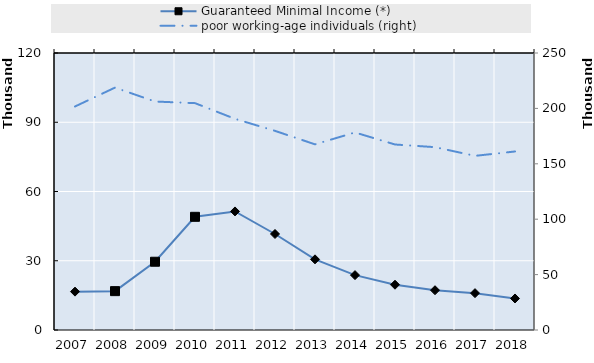
| Category | Guaranteed Minimal Income (*) | Series 4 | Series 5 | Series 6 | Series 7 | Series 8 | Series 9 | Series 10 | Series 11 | Series 12 | Series 13 | Series 14 | Series 15 | Series 16 | Series 17 | Series 18 | Series 19 |
|---|---|---|---|---|---|---|---|---|---|---|---|---|---|---|---|---|---|
| 2007.0 | 16619 |  |  |  |  |  |  |  |  |  |  |  |  |  |  |  |  |
| 2008.0 | 16835 |  |  |  |  |  |  |  |  |  |  |  |  |  |  |  |  |
| 2009.0 | 29573 |  |  |  |  |  |  |  |  |  |  |  |  |  |  |  |  |
| 2010.0 | 49034 |  |  |  |  |  |  |  |  |  |  |  |  |  |  |  |  |
| 2011.0 | 51369 |  |  |  |  |  |  |  |  |  |  |  |  |  |  |  |  |
| 2012.0 | 41595 |  |  |  |  |  |  |  |  |  |  |  |  |  |  |  |  |
| 2013.0 | 30613 |  |  |  |  |  |  |  |  |  |  |  |  |  |  |  |  |
| 2014.0 | 23776 |  |  |  |  |  |  |  |  |  |  |  |  |  |  |  |  |
| 2015.0 | 19610 |  |  |  |  |  |  |  |  |  |  |  |  |  |  |  |  |
| 2016.0 | 17229 |  |  |  |  |  |  |  |  |  |  |  |  |  |  |  |  |
| 2017.0 | 15962 |  |  |  |  |  |  |  |  |  |  |  |  |  |  |  |  |
| 2018.0 | 13659 |  |  |  |  |  |  |  |  |  |  |  |  |  |  |  |  |